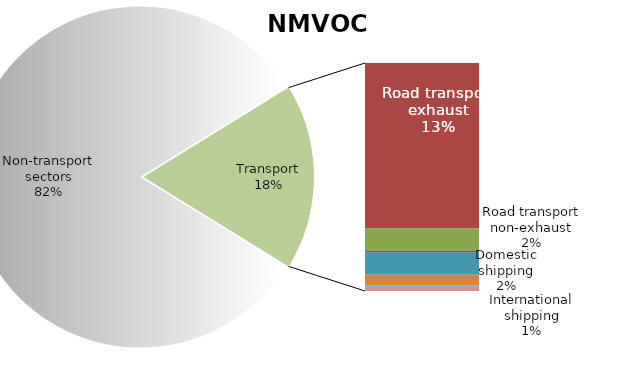
| Category | Series 0 |
|---|---|
| Non-transport sectors | 7499.284 |
| Road transport exhaust | 1159.26 |
| Road transport non-exhaust | 157.432 |
| Railways | 13.344 |
| Domestic shipping | 152.521 |
| International shipping | 78.68 |
| Domestic aviation | 8.417 |
| International aviation | 27.609 |